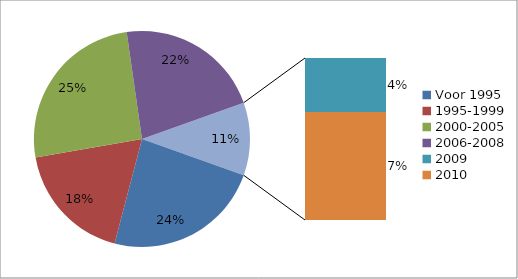
| Category | Series 0 |
|---|---|
| Voor 1995 | 13 |
| 1995-1999 | 10 |
| 2000-2005 | 14 |
| 2006-2008 | 12 |
| 2009 | 2 |
| 2010 | 4 |